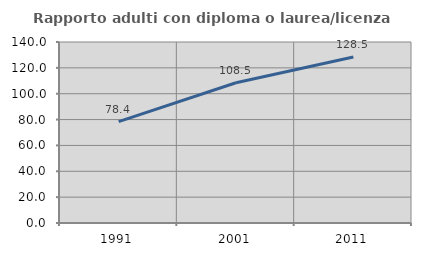
| Category | Rapporto adulti con diploma o laurea/licenza media  |
|---|---|
| 1991.0 | 78.431 |
| 2001.0 | 108.451 |
| 2011.0 | 128.467 |